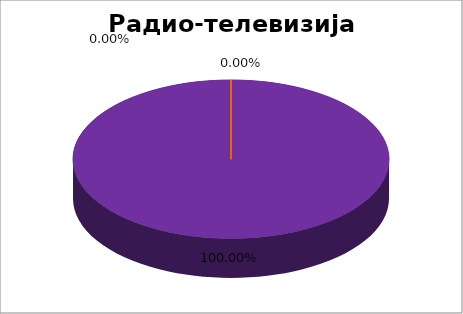
| Category | Радио-телевизија Србије  |
|---|---|
| 0 | 0 |
| 1 | 0 |
| 2 | 0 |
| 3 | 0 |
| 4 | 1 |